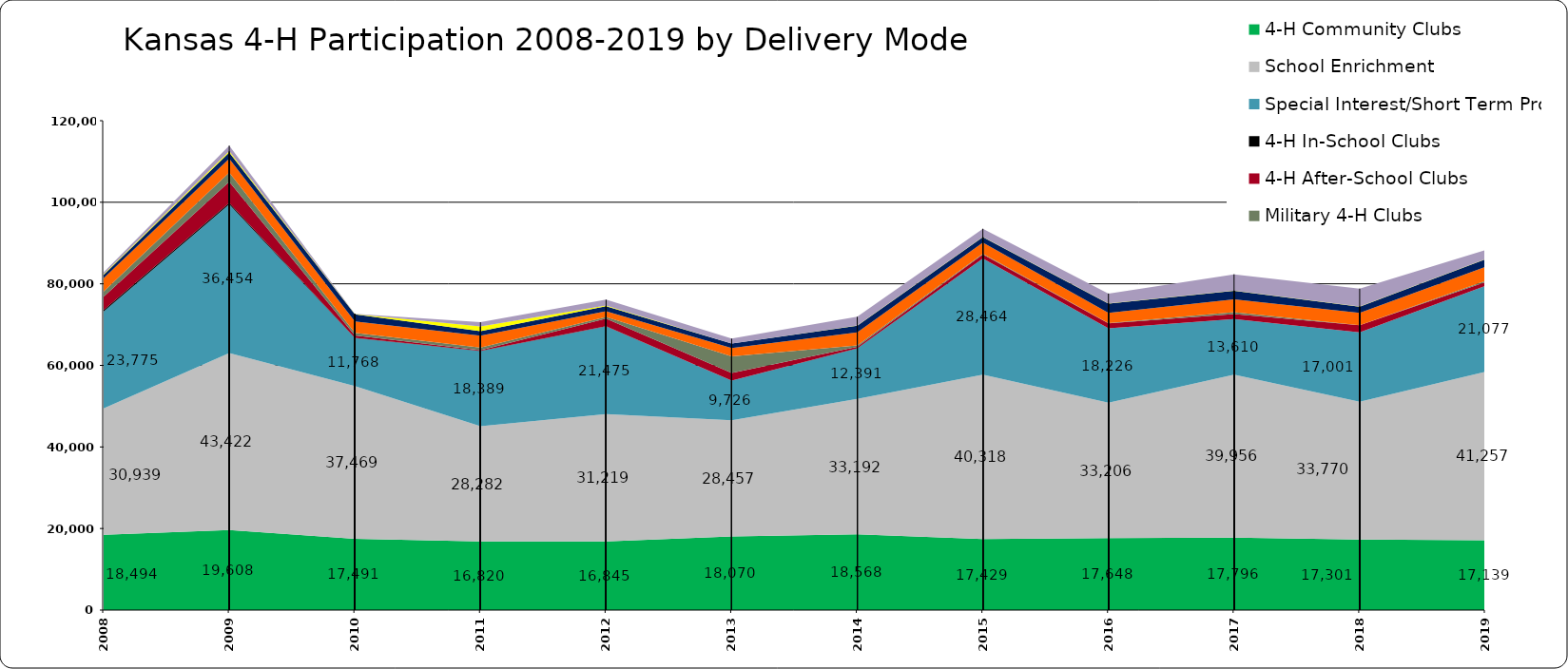
| Category | 4-H Community Clubs | School Enrichment | Special Interest/Short Term Prog | 4-H In-School Clubs | 4-H After-School Clubs | Military 4-H Clubs | 4-H Overnight Camping | 4-H Day Camping | Individual Study/Mentoring | School-Aged Child Care |
|---|---|---|---|---|---|---|---|---|---|---|
| 2008.0 | 18494 | 30939 | 23775 | 375 | 3272 | 1236 | 3293 | 801 | 190 | 486 |
| 2009.0 | 19608 | 43422 | 36454 | 371 | 5198 | 2232 | 3393 | 1491 | 349 | 1359 |
| 2010.0 | 17491 | 37469 | 11768 | 39 | 566 | 636 | 2789 | 1794 | 36 | 48 |
| 2011.0 | 16820 | 28282 | 18389 | 88 | 171 | 629 | 2921 | 1116 | 1118 | 1052 |
| 2012.0 | 16845 | 31219 | 21475 | 90 | 1824 | 413 | 1411 | 1210 | 171 | 1450 |
| 2013.0 | 18070 | 28457 | 9726 | 0 | 1870 | 4074 | 2030 | 1129 | 20 | 1188 |
| 2014.0 | 18568 | 33192 | 12391 | 66 | 329 | 366 | 3183 | 1612 | 69 | 2137 |
| 2015.0 | 17429 | 40318 | 28464 | 25 | 981 | 154 | 2738 | 1354 | 56 | 1982 |
| 2016.0 | 17648 | 33206 | 18226 | 0 | 1229 | 71 | 2502 | 2262 | 63 | 2410 |
| 2017.0 | 17796 | 39956 | 13610 | 0 | 1228 | 447 | 3148 | 2127 | 54 | 3968 |
| 2018.0 | 17301 | 33770 | 17001 | 0 | 1770 | 0 | 3027 | 1526 | 46 | 4381 |
| 2019.0 | 17139 | 41257 | 21077 | 0 | 932 | 314 | 3429 | 1882 | 58 | 2168 |